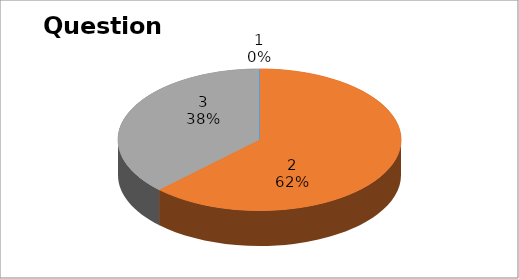
| Category | Series 0 |
|---|---|
| 0 | 0 |
| 1 | 5 |
| 2 | 3 |